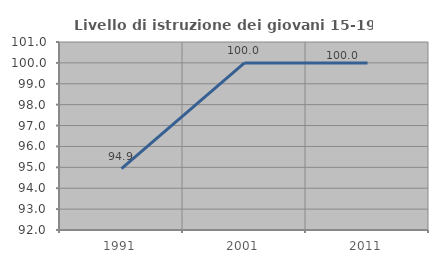
| Category | Livello di istruzione dei giovani 15-19 anni |
|---|---|
| 1991.0 | 94.937 |
| 2001.0 | 100 |
| 2011.0 | 100 |